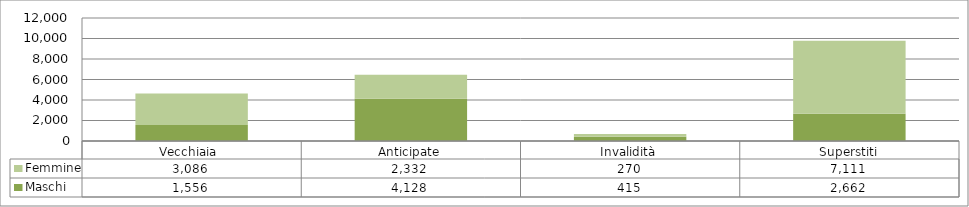
| Category | Maschi | Femmine |
|---|---|---|
| Vecchiaia  | 1556 | 3086 |
| Anticipate | 4128 | 2332 |
| Invalidità | 415 | 270 |
| Superstiti | 2662 | 7111 |